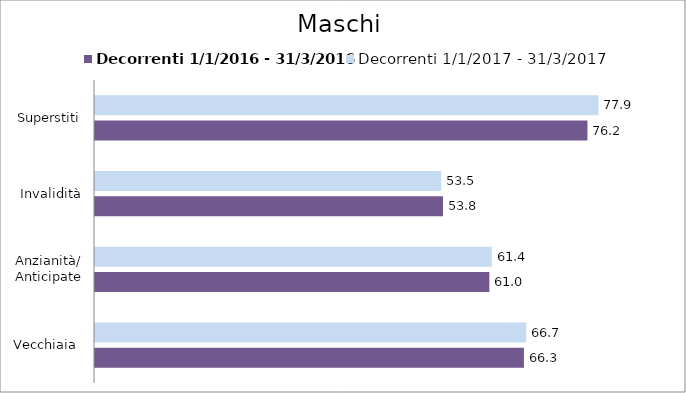
| Category | Decorrenti 1/1/2016 - 31/3/2016 | Decorrenti 1/1/2017 - 31/3/2017 |
|---|---|---|
| Vecchiaia  | 66.33 | 66.68 |
| Anzianità/ Anticipate | 60.98 | 61.37 |
| Invalidità | 53.81 | 53.53 |
| Superstiti | 76.15 | 77.86 |